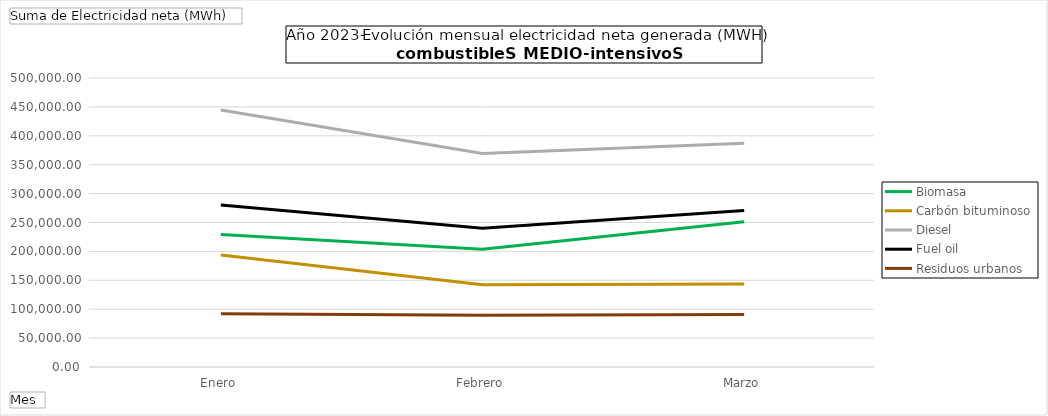
| Category | Biomasa | Carbón bituminoso | Diesel | Fuel oil | Residuos urbanos |
|---|---|---|---|---|---|
| Enero | 229179.683 | 193905.33 | 444569.713 | 280174.75 | 91944.503 |
| Febrero | 203764.77 | 142331.54 | 369325.377 | 240211.71 | 89673.74 |
| Marzo | 251376.29 | 143393.26 | 387293.057 | 270620.45 | 90653.12 |